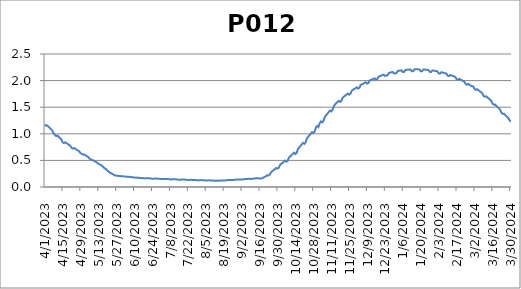
| Category | P012 |
|---|---|
| 4/1/23 | 1.177 |
| 4/2/23 | 1.151 |
| 4/3/23 | 1.158 |
| 4/4/23 | 1.133 |
| 4/5/23 | 1.109 |
| 4/6/23 | 1.084 |
| 4/7/23 | 1.06 |
| 4/8/23 | 1.005 |
| 4/9/23 | 0.98 |
| 4/10/23 | 0.957 |
| 4/11/23 | 0.966 |
| 4/12/23 | 0.942 |
| 4/13/23 | 0.919 |
| 4/14/23 | 0.897 |
| 4/15/23 | 0.841 |
| 4/16/23 | 0.825 |
| 4/17/23 | 0.841 |
| 4/18/23 | 0.825 |
| 4/19/23 | 0.809 |
| 4/20/23 | 0.793 |
| 4/21/23 | 0.778 |
| 4/22/23 | 0.737 |
| 4/23/23 | 0.723 |
| 4/24/23 | 0.732 |
| 4/25/23 | 0.716 |
| 4/26/23 | 0.701 |
| 4/27/23 | 0.686 |
| 4/28/23 | 0.671 |
| 4/29/23 | 0.637 |
| 4/30/23 | 0.623 |
| 5/1/23 | 0.608 |
| 5/2/23 | 0.61 |
| 5/3/23 | 0.595 |
| 5/4/23 | 0.58 |
| 5/5/23 | 0.564 |
| 5/6/23 | 0.536 |
| 5/7/23 | 0.521 |
| 5/8/23 | 0.506 |
| 5/9/23 | 0.502 |
| 5/10/23 | 0.487 |
| 5/11/23 | 0.472 |
| 5/12/23 | 0.458 |
| 5/13/23 | 0.436 |
| 5/14/23 | 0.424 |
| 5/15/23 | 0.414 |
| 5/16/23 | 0.394 |
| 5/17/23 | 0.374 |
| 5/18/23 | 0.349 |
| 5/19/23 | 0.335 |
| 5/20/23 | 0.31 |
| 5/21/23 | 0.289 |
| 5/22/23 | 0.272 |
| 5/23/23 | 0.258 |
| 5/24/23 | 0.244 |
| 5/25/23 | 0.231 |
| 5/26/23 | 0.217 |
| 5/27/23 | 0.214 |
| 5/28/23 | 0.211 |
| 5/29/23 | 0.208 |
| 5/30/23 | 0.205 |
| 5/31/23 | 0.202 |
| 6/1/23 | 0.202 |
| 6/2/23 | 0.199 |
| 6/3/23 | 0.197 |
| 6/4/23 | 0.194 |
| 6/5/23 | 0.192 |
| 6/6/23 | 0.19 |
| 6/7/23 | 0.188 |
| 6/8/23 | 0.185 |
| 6/9/23 | 0.183 |
| 6/10/23 | 0.178 |
| 6/11/23 | 0.175 |
| 6/12/23 | 0.176 |
| 6/13/23 | 0.174 |
| 6/14/23 | 0.172 |
| 6/15/23 | 0.17 |
| 6/16/23 | 0.169 |
| 6/17/23 | 0.163 |
| 6/18/23 | 0.162 |
| 6/19/23 | 0.166 |
| 6/20/23 | 0.165 |
| 6/21/23 | 0.164 |
| 6/22/23 | 0.163 |
| 6/23/23 | 0.162 |
| 6/24/23 | 0.156 |
| 6/25/23 | 0.155 |
| 6/26/23 | 0.159 |
| 6/27/23 | 0.158 |
| 6/28/23 | 0.157 |
| 6/29/23 | 0.156 |
| 6/30/23 | 0.155 |
| 7/1/23 | 0.149 |
| 7/2/23 | 0.148 |
| 7/3/23 | 0.152 |
| 7/4/23 | 0.152 |
| 7/5/23 | 0.151 |
| 7/6/23 | 0.15 |
| 7/7/23 | 0.149 |
| 7/8/23 | 0.143 |
| 7/9/23 | 0.142 |
| 7/10/23 | 0.147 |
| 7/11/23 | 0.146 |
| 7/12/23 | 0.145 |
| 7/13/23 | 0.145 |
| 7/14/23 | 0.138 |
| 7/15/23 | 0.138 |
| 7/16/23 | 0.137 |
| 7/17/23 | 0.141 |
| 7/18/23 | 0.14 |
| 7/19/23 | 0.139 |
| 7/20/23 | 0.138 |
| 7/21/23 | 0.138 |
| 7/22/23 | 0.131 |
| 7/23/23 | 0.13 |
| 7/24/23 | 0.135 |
| 7/25/23 | 0.134 |
| 7/26/23 | 0.133 |
| 7/27/23 | 0.132 |
| 7/28/23 | 0.132 |
| 7/29/23 | 0.125 |
| 7/30/23 | 0.124 |
| 7/31/23 | 0.129 |
| 8/1/23 | 0.129 |
| 8/2/23 | 0.128 |
| 8/3/23 | 0.128 |
| 8/4/23 | 0.127 |
| 8/5/23 | 0.121 |
| 8/6/23 | 0.12 |
| 8/7/23 | 0.125 |
| 8/8/23 | 0.124 |
| 8/9/23 | 0.124 |
| 8/10/23 | 0.123 |
| 8/11/23 | 0.123 |
| 8/12/23 | 0.116 |
| 8/13/23 | 0.116 |
| 8/14/23 | 0.121 |
| 8/15/23 | 0.115 |
| 8/16/23 | 0.122 |
| 8/17/23 | 0.123 |
| 8/18/23 | 0.124 |
| 8/19/23 | 0.12 |
| 8/20/23 | 0.121 |
| 8/21/23 | 0.128 |
| 8/22/23 | 0.13 |
| 8/23/23 | 0.131 |
| 8/24/23 | 0.133 |
| 8/25/23 | 0.134 |
| 8/26/23 | 0.13 |
| 8/27/23 | 0.131 |
| 8/28/23 | 0.138 |
| 8/29/23 | 0.14 |
| 8/30/23 | 0.141 |
| 8/31/23 | 0.143 |
| 9/1/23 | 0.143 |
| 9/2/23 | 0.139 |
| 9/3/23 | 0.141 |
| 9/4/23 | 0.148 |
| 9/5/23 | 0.149 |
| 9/6/23 | 0.151 |
| 9/7/23 | 0.153 |
| 9/8/23 | 0.154 |
| 9/9/23 | 0.151 |
| 9/10/23 | 0.152 |
| 9/11/23 | 0.159 |
| 9/12/23 | 0.161 |
| 9/13/23 | 0.162 |
| 9/14/23 | 0.164 |
| 9/15/23 | 0.166 |
| 9/16/23 | 0.16 |
| 9/17/23 | 0.158 |
| 9/18/23 | 0.165 |
| 9/19/23 | 0.178 |
| 9/20/23 | 0.191 |
| 9/21/23 | 0.203 |
| 9/22/23 | 0.22 |
| 9/23/23 | 0.217 |
| 9/24/23 | 0.236 |
| 9/25/23 | 0.279 |
| 9/26/23 | 0.299 |
| 9/27/23 | 0.318 |
| 9/28/23 | 0.338 |
| 9/29/23 | 0.357 |
| 9/30/23 | 0.345 |
| 10/1/23 | 0.364 |
| 10/2/23 | 0.415 |
| 10/3/23 | 0.436 |
| 10/4/23 | 0.456 |
| 10/5/23 | 0.475 |
| 10/6/23 | 0.496 |
| 10/7/23 | 0.476 |
| 10/8/23 | 0.495 |
| 10/9/23 | 0.557 |
| 10/10/23 | 0.577 |
| 10/11/23 | 0.6 |
| 10/12/23 | 0.621 |
| 10/13/23 | 0.644 |
| 10/14/23 | 0.62 |
| 10/15/23 | 0.641 |
| 10/16/23 | 0.718 |
| 10/17/23 | 0.745 |
| 10/18/23 | 0.774 |
| 10/19/23 | 0.803 |
| 10/20/23 | 0.83 |
| 10/21/23 | 0.811 |
| 10/22/23 | 0.84 |
| 10/23/23 | 0.916 |
| 10/24/23 | 0.945 |
| 10/25/23 | 0.973 |
| 10/26/23 | 1.001 |
| 10/27/23 | 1.031 |
| 10/28/23 | 1.013 |
| 10/29/23 | 1.043 |
| 10/30/23 | 1.118 |
| 10/31/23 | 1.148 |
| 11/1/23 | 1.128 |
| 11/2/23 | 1.202 |
| 11/3/23 | 1.232 |
| 11/4/23 | 1.215 |
| 11/5/23 | 1.246 |
| 11/6/23 | 1.319 |
| 11/7/23 | 1.348 |
| 11/8/23 | 1.378 |
| 11/9/23 | 1.407 |
| 11/10/23 | 1.436 |
| 11/11/23 | 1.42 |
| 11/12/23 | 1.45 |
| 11/13/23 | 1.522 |
| 11/14/23 | 1.55 |
| 11/15/23 | 1.579 |
| 11/16/23 | 1.599 |
| 11/17/23 | 1.62 |
| 11/18/23 | 1.6 |
| 11/19/23 | 1.619 |
| 11/20/23 | 1.681 |
| 11/21/23 | 1.7 |
| 11/22/23 | 1.72 |
| 11/23/23 | 1.738 |
| 11/24/23 | 1.757 |
| 11/25/23 | 1.735 |
| 11/26/23 | 1.752 |
| 11/27/23 | 1.809 |
| 11/28/23 | 1.827 |
| 11/29/23 | 1.843 |
| 11/30/23 | 1.858 |
| 12/1/23 | 1.873 |
| 12/2/23 | 1.85 |
| 12/3/23 | 1.866 |
| 12/4/23 | 1.918 |
| 12/5/23 | 1.931 |
| 12/6/23 | 1.943 |
| 12/7/23 | 1.957 |
| 12/8/23 | 1.969 |
| 12/9/23 | 1.944 |
| 12/10/23 | 1.955 |
| 12/11/23 | 2.002 |
| 12/12/23 | 2.013 |
| 12/13/23 | 2.023 |
| 12/14/23 | 2.032 |
| 12/15/23 | 2.042 |
| 12/16/23 | 2.017 |
| 12/17/23 | 2.029 |
| 12/18/23 | 2.074 |
| 12/19/23 | 2.085 |
| 12/20/23 | 2.093 |
| 12/21/23 | 2.104 |
| 12/22/23 | 2.112 |
| 12/23/23 | 2.086 |
| 12/24/23 | 2.094 |
| 12/25/23 | 2.1 |
| 12/26/23 | 2.143 |
| 12/27/23 | 2.151 |
| 12/28/23 | 2.157 |
| 12/29/23 | 2.163 |
| 12/30/23 | 2.135 |
| 12/31/23 | 2.138 |
| 1/1/24 | 2.142 |
| 1/2/24 | 2.181 |
| 1/3/24 | 2.186 |
| 1/4/24 | 2.19 |
| 1/5/24 | 2.193 |
| 1/6/24 | 2.16 |
| 1/7/24 | 2.164 |
| 1/8/24 | 2.201 |
| 1/9/24 | 2.202 |
| 1/10/24 | 2.205 |
| 1/11/24 | 2.206 |
| 1/12/24 | 2.208 |
| 1/13/24 | 2.175 |
| 1/14/24 | 2.175 |
| 1/15/24 | 2.211 |
| 1/16/24 | 2.211 |
| 1/17/24 | 2.211 |
| 1/18/24 | 2.211 |
| 1/19/24 | 2.21 |
| 1/20/24 | 2.175 |
| 1/21/24 | 2.175 |
| 1/22/24 | 2.208 |
| 1/23/24 | 2.206 |
| 1/24/24 | 2.204 |
| 1/25/24 | 2.202 |
| 1/26/24 | 2.2 |
| 1/27/24 | 2.164 |
| 1/28/24 | 2.161 |
| 1/29/24 | 2.191 |
| 1/30/24 | 2.187 |
| 1/31/24 | 2.184 |
| 2/1/24 | 2.179 |
| 2/2/24 | 2.174 |
| 2/3/24 | 2.136 |
| 2/4/24 | 2.131 |
| 2/5/24 | 2.158 |
| 2/6/24 | 2.152 |
| 2/7/24 | 2.145 |
| 2/8/24 | 2.138 |
| 2/9/24 | 2.131 |
| 2/10/24 | 2.091 |
| 2/11/24 | 2.084 |
| 2/12/24 | 2.106 |
| 2/13/24 | 2.096 |
| 2/14/24 | 2.087 |
| 2/15/24 | 2.078 |
| 2/16/24 | 2.067 |
| 2/17/24 | 2.025 |
| 2/18/24 | 2.014 |
| 2/19/24 | 2.033 |
| 2/20/24 | 2.021 |
| 2/21/24 | 2.008 |
| 2/22/24 | 1.995 |
| 2/23/24 | 1.981 |
| 2/24/24 | 1.937 |
| 2/25/24 | 1.923 |
| 2/26/24 | 1.938 |
| 2/27/24 | 1.923 |
| 2/28/24 | 1.906 |
| 2/29/24 | 1.898 |
| 3/1/24 | 1.889 |
| 3/2/24 | 1.845 |
| 3/3/24 | 1.827 |
| 3/4/24 | 1.839 |
| 3/5/24 | 1.82 |
| 3/6/24 | 1.803 |
| 3/7/24 | 1.783 |
| 3/8/24 | 1.764 |
| 3/9/24 | 1.716 |
| 3/10/24 | 1.697 |
| 3/11/24 | 1.705 |
| 3/12/24 | 1.686 |
| 3/13/24 | 1.665 |
| 3/14/24 | 1.644 |
| 3/15/24 | 1.622 |
| 3/16/24 | 1.571 |
| 3/17/24 | 1.547 |
| 3/18/24 | 1.55 |
| 3/19/24 | 1.526 |
| 3/20/24 | 1.503 |
| 3/21/24 | 1.478 |
| 3/22/24 | 1.453 |
| 3/23/24 | 1.4 |
| 3/24/24 | 1.373 |
| 3/25/24 | 1.378 |
| 3/26/24 | 1.353 |
| 3/27/24 | 1.329 |
| 3/28/24 | 1.304 |
| 3/29/24 | 1.278 |
| 3/30/24 | 1.224 |